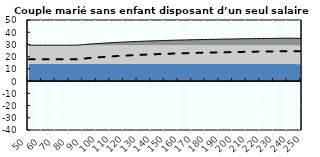
| Category | Coin fiscal moyen (somme des composantes) | Taux moyen d'imposition net en % du salaire brut |
|---|---|---|
| 50.0 | 29.379 | 17.826 |
| 51.0 | 29.379 | 17.826 |
| 52.0 | 29.379 | 17.826 |
| 53.0 | 29.379 | 17.826 |
| 54.0 | 29.379 | 17.826 |
| 55.0 | 29.379 | 17.826 |
| 56.0 | 29.379 | 17.826 |
| 57.0 | 29.379 | 17.826 |
| 58.0 | 29.379 | 17.826 |
| 59.0 | 29.379 | 17.826 |
| 60.0 | 29.379 | 17.826 |
| 61.0 | 29.379 | 17.826 |
| 62.0 | 29.379 | 17.826 |
| 63.0 | 29.379 | 17.826 |
| 64.0 | 29.379 | 17.826 |
| 65.0 | 29.379 | 17.826 |
| 66.0 | 29.379 | 17.826 |
| 67.0 | 29.379 | 17.826 |
| 68.0 | 29.379 | 17.826 |
| 69.0 | 29.379 | 17.826 |
| 70.0 | 29.379 | 17.826 |
| 71.0 | 29.379 | 17.826 |
| 72.0 | 29.379 | 17.826 |
| 73.0 | 29.379 | 17.826 |
| 74.0 | 29.379 | 17.826 |
| 75.0 | 29.379 | 17.826 |
| 76.0 | 29.379 | 17.826 |
| 77.0 | 29.379 | 17.826 |
| 78.0 | 29.379 | 17.826 |
| 79.0 | 29.379 | 17.826 |
| 80.0 | 29.379 | 17.826 |
| 81.0 | 29.379 | 17.826 |
| 82.0 | 29.379 | 17.826 |
| 83.0 | 29.379 | 17.826 |
| 84.0 | 29.379 | 17.826 |
| 85.0 | 29.379 | 17.826 |
| 86.0 | 29.464 | 17.925 |
| 87.0 | 29.566 | 18.043 |
| 88.0 | 29.665 | 18.158 |
| 89.0 | 29.762 | 18.271 |
| 90.0 | 29.856 | 18.381 |
| 91.0 | 29.949 | 18.488 |
| 92.0 | 30.039 | 18.594 |
| 93.0 | 30.128 | 18.697 |
| 94.0 | 30.215 | 18.798 |
| 95.0 | 30.299 | 18.896 |
| 96.0 | 30.383 | 18.993 |
| 97.0 | 30.464 | 19.088 |
| 98.0 | 30.544 | 19.181 |
| 99.0 | 30.622 | 19.272 |
| 100.0 | 30.698 | 19.361 |
| 101.0 | 30.773 | 19.448 |
| 102.0 | 30.847 | 19.534 |
| 103.0 | 30.919 | 19.618 |
| 104.0 | 30.99 | 19.7 |
| 105.0 | 31.059 | 19.781 |
| 106.0 | 31.127 | 19.86 |
| 107.0 | 31.194 | 19.938 |
| 108.0 | 31.26 | 20.014 |
| 109.0 | 31.324 | 20.089 |
| 110.0 | 31.387 | 20.163 |
| 111.0 | 31.45 | 20.235 |
| 112.0 | 31.51 | 20.306 |
| 113.0 | 31.57 | 20.375 |
| 114.0 | 31.629 | 20.444 |
| 115.0 | 31.687 | 20.511 |
| 116.0 | 31.744 | 20.577 |
| 117.0 | 31.8 | 20.642 |
| 118.0 | 31.855 | 20.706 |
| 119.0 | 31.909 | 20.769 |
| 120.0 | 31.962 | 20.831 |
| 121.0 | 32.014 | 20.891 |
| 122.0 | 32.065 | 20.951 |
| 123.0 | 32.116 | 21.01 |
| 124.0 | 32.165 | 21.068 |
| 125.0 | 32.214 | 21.125 |
| 126.0 | 32.262 | 21.181 |
| 127.0 | 32.31 | 21.236 |
| 128.0 | 32.356 | 21.29 |
| 129.0 | 32.402 | 21.343 |
| 130.0 | 32.448 | 21.396 |
| 131.0 | 32.492 | 21.448 |
| 132.0 | 32.536 | 21.499 |
| 133.0 | 32.579 | 21.549 |
| 134.0 | 32.622 | 21.599 |
| 135.0 | 32.664 | 21.647 |
| 136.0 | 32.705 | 21.695 |
| 137.0 | 32.745 | 21.743 |
| 138.0 | 32.786 | 21.789 |
| 139.0 | 32.825 | 21.835 |
| 140.0 | 32.864 | 21.881 |
| 141.0 | 32.902 | 21.925 |
| 142.0 | 32.94 | 21.969 |
| 143.0 | 32.978 | 22.013 |
| 144.0 | 33.014 | 22.056 |
| 145.0 | 33.051 | 22.098 |
| 146.0 | 33.087 | 22.14 |
| 147.0 | 33.122 | 22.181 |
| 148.0 | 33.157 | 22.221 |
| 149.0 | 33.191 | 22.261 |
| 150.0 | 33.225 | 22.301 |
| 151.0 | 33.258 | 22.34 |
| 152.0 | 33.291 | 22.378 |
| 153.0 | 33.324 | 22.416 |
| 154.0 | 33.356 | 22.453 |
| 155.0 | 33.388 | 22.49 |
| 156.0 | 33.419 | 22.527 |
| 157.0 | 33.45 | 22.563 |
| 158.0 | 33.481 | 22.598 |
| 159.0 | 33.511 | 22.634 |
| 160.0 | 33.541 | 22.668 |
| 161.0 | 33.57 | 22.702 |
| 162.0 | 33.599 | 22.736 |
| 163.0 | 33.628 | 22.77 |
| 164.0 | 33.656 | 22.803 |
| 165.0 | 33.684 | 22.835 |
| 166.0 | 33.712 | 22.867 |
| 167.0 | 33.739 | 22.899 |
| 168.0 | 33.766 | 22.931 |
| 169.0 | 33.793 | 22.962 |
| 170.0 | 33.819 | 22.992 |
| 171.0 | 33.846 | 23.023 |
| 172.0 | 33.871 | 23.053 |
| 173.0 | 33.897 | 23.082 |
| 174.0 | 33.922 | 23.112 |
| 175.0 | 33.947 | 23.141 |
| 176.0 | 33.971 | 23.169 |
| 177.0 | 33.996 | 23.198 |
| 178.0 | 34.02 | 23.226 |
| 179.0 | 34.044 | 23.253 |
| 180.0 | 34.067 | 23.281 |
| 181.0 | 34.09 | 23.308 |
| 182.0 | 34.113 | 23.335 |
| 183.0 | 34.136 | 23.361 |
| 184.0 | 34.159 | 23.387 |
| 185.0 | 34.181 | 23.413 |
| 186.0 | 34.203 | 23.439 |
| 187.0 | 34.225 | 23.464 |
| 188.0 | 34.246 | 23.489 |
| 189.0 | 34.268 | 23.514 |
| 190.0 | 34.289 | 23.539 |
| 191.0 | 34.31 | 23.563 |
| 192.0 | 34.33 | 23.587 |
| 193.0 | 34.351 | 23.611 |
| 194.0 | 34.371 | 23.634 |
| 195.0 | 34.391 | 23.658 |
| 196.0 | 34.411 | 23.681 |
| 197.0 | 34.431 | 23.704 |
| 198.0 | 34.45 | 23.726 |
| 199.0 | 34.469 | 23.749 |
| 200.0 | 34.488 | 23.771 |
| 201.0 | 34.507 | 23.793 |
| 202.0 | 34.526 | 23.814 |
| 203.0 | 34.544 | 23.836 |
| 204.0 | 34.563 | 23.857 |
| 205.0 | 34.581 | 23.878 |
| 206.0 | 34.599 | 23.899 |
| 207.0 | 34.616 | 23.92 |
| 208.0 | 34.634 | 23.94 |
| 209.0 | 34.652 | 23.961 |
| 210.0 | 34.669 | 23.981 |
| 211.0 | 34.686 | 24.001 |
| 212.0 | 34.703 | 24.02 |
| 213.0 | 34.72 | 24.04 |
| 214.0 | 34.736 | 24.059 |
| 215.0 | 34.753 | 24.078 |
| 216.0 | 34.769 | 24.097 |
| 217.0 | 34.785 | 24.116 |
| 218.0 | 34.801 | 24.135 |
| 219.0 | 34.817 | 24.153 |
| 220.0 | 34.833 | 24.172 |
| 221.0 | 34.848 | 24.19 |
| 222.0 | 34.864 | 24.208 |
| 223.0 | 34.879 | 24.226 |
| 224.0 | 34.894 | 24.243 |
| 225.0 | 34.909 | 24.261 |
| 226.0 | 34.924 | 24.278 |
| 227.0 | 34.939 | 24.295 |
| 228.0 | 34.954 | 24.312 |
| 229.0 | 34.968 | 24.329 |
| 230.0 | 34.983 | 24.346 |
| 231.0 | 34.997 | 24.362 |
| 232.0 | 35.011 | 24.379 |
| 233.0 | 35.025 | 24.395 |
| 234.0 | 35.039 | 24.411 |
| 235.0 | 35.053 | 24.427 |
| 236.0 | 35.066 | 24.443 |
| 237.0 | 35.08 | 24.459 |
| 238.0 | 35.093 | 24.475 |
| 239.0 | 35.107 | 24.49 |
| 240.0 | 35.12 | 24.506 |
| 241.0 | 35.133 | 24.521 |
| 242.0 | 35.146 | 24.536 |
| 243.0 | 35.146 | 24.545 |
| 244.0 | 35.111 | 24.538 |
| 245.0 | 35.077 | 24.532 |
| 246.0 | 35.043 | 24.525 |
| 247.0 | 35.009 | 24.519 |
| 248.0 | 34.976 | 24.513 |
| 249.0 | 34.943 | 24.506 |
| 250.0 | 34.91 | 24.5 |